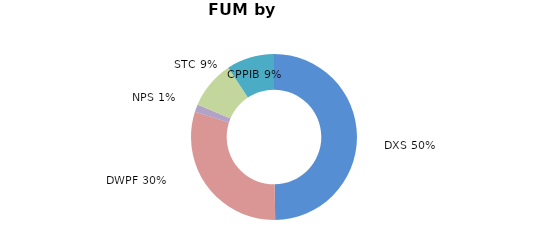
| Category | Series 0 |
|---|---|
| DXS | 0.496 |
| DWPF | 0.301 |
| NPS | 0.015 |
| STC | 0.093 |
| CPPIB | 0.093 |